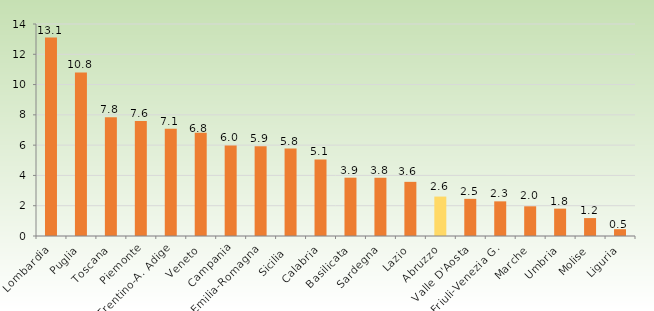
| Category | Series 0 |
|---|---|
| Lombardia | 13.102 |
| Puglia | 10.801 |
| Toscana | 7.84 |
| Piemonte | 7.595 |
| Trentino-A. Adige | 7.086 |
| Veneto | 6.821 |
| Campania | 5.979 |
| Emilia-Romagna | 5.923 |
| Sicilia  | 5.776 |
| Calabria | 5.059 |
| Basilicata | 3.851 |
| Sardegna | 3.846 |
| Lazio | 3.576 |
| Abruzzo | 2.604 |
| Valle D'Aosta | 2.454 |
| Friuli-Venezia G. | 2.288 |
| Marche | 1.961 |
| Umbria | 1.807 |
| Molise | 1.183 |
| Liguria | 0.451 |